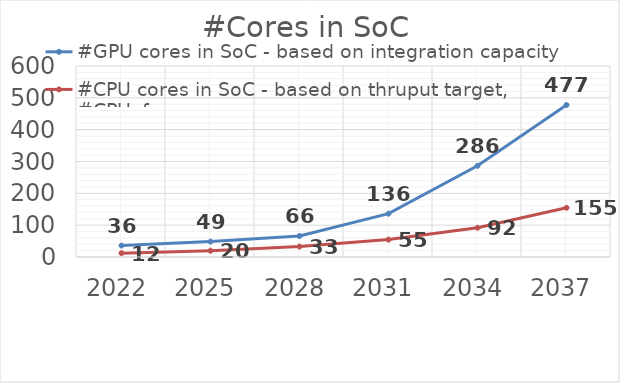
| Category | #GPU cores in SoC - based on integration capacity | #CPU cores in SoC - based on thruput target, #CPUxfmax |
|---|---|---|
| 2022.0 | 36 | 12 |
| 2025.0 | 48.505 | 19.798 |
| 2028.0 | 65.829 | 32.819 |
| 2031.0 | 136.08 | 54.771 |
| 2034.0 | 286.484 | 91.905 |
| 2037.0 | 477.474 | 154.597 |